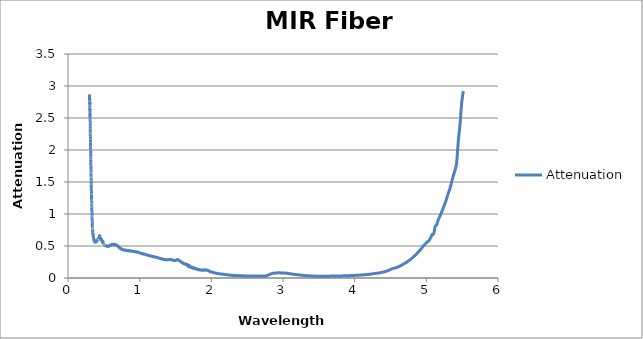
| Category | Attenuation |
|---|---|
| 0.30052 | 2.867 |
| 0.30089 | 2.803 |
| 0.30126 | 2.778 |
| 0.30163 | 2.82 |
| 0.302 | 2.788 |
| 0.30237 | 2.769 |
| 0.30274 | 2.752 |
| 0.30311 | 2.742 |
| 0.30347 | 2.718 |
| 0.30384 | 2.746 |
| 0.30421 | 2.695 |
| 0.30458 | 2.664 |
| 0.30495 | 2.626 |
| 0.30532 | 2.636 |
| 0.30568 | 2.626 |
| 0.30605 | 2.592 |
| 0.30642 | 2.564 |
| 0.30679 | 2.544 |
| 0.30716 | 2.553 |
| 0.30753 | 2.511 |
| 0.30789 | 2.491 |
| 0.30826 | 2.471 |
| 0.30863 | 2.463 |
| 0.309 | 2.429 |
| 0.30937 | 2.402 |
| 0.30973 | 2.368 |
| 0.3101 | 2.341 |
| 0.31047 | 2.325 |
| 0.31084 | 2.311 |
| 0.31121 | 2.275 |
| 0.31157 | 2.254 |
| 0.31194 | 2.24 |
| 0.31231 | 2.21 |
| 0.31268 | 2.174 |
| 0.31305 | 2.165 |
| 0.31342 | 2.125 |
| 0.31378 | 2.115 |
| 0.31415 | 2.078 |
| 0.31452 | 2.067 |
| 0.31489 | 2.038 |
| 0.31525 | 2.006 |
| 0.31562 | 1.993 |
| 0.31599 | 1.97 |
| 0.31636 | 1.951 |
| 0.31672 | 1.922 |
| 0.31709 | 1.897 |
| 0.31746 | 1.867 |
| 0.31783 | 1.852 |
| 0.31819 | 1.814 |
| 0.31856 | 1.804 |
| 0.31893 | 1.777 |
| 0.3193 | 1.759 |
| 0.31966 | 1.736 |
| 0.32003 | 1.719 |
| 0.3204 | 1.692 |
| 0.32076 | 1.669 |
| 0.32113 | 1.654 |
| 0.3215 | 1.631 |
| 0.32187 | 1.609 |
| 0.32223 | 1.586 |
| 0.3226 | 1.571 |
| 0.32297 | 1.551 |
| 0.32333 | 1.528 |
| 0.3237 | 1.513 |
| 0.32407 | 1.482 |
| 0.32443 | 1.46 |
| 0.3248 | 1.437 |
| 0.32517 | 1.422 |
| 0.32553 | 1.402 |
| 0.3259 | 1.379 |
| 0.32627 | 1.357 |
| 0.32663 | 1.343 |
| 0.327 | 1.324 |
| 0.32737 | 1.318 |
| 0.32773 | 1.306 |
| 0.3281 | 1.298 |
| 0.32847 | 1.282 |
| 0.32883 | 1.266 |
| 0.3292 | 1.229 |
| 0.32957 | 1.209 |
| 0.32993 | 1.194 |
| 0.3303 | 1.175 |
| 0.33067 | 1.165 |
| 0.33103 | 1.146 |
| 0.3314 | 1.127 |
| 0.33176 | 1.119 |
| 0.33213 | 1.104 |
| 0.3325 | 1.085 |
| 0.33286 | 1.062 |
| 0.33323 | 1.045 |
| 0.33359 | 1.035 |
| 0.33396 | 1.015 |
| 0.33433 | 1.002 |
| 0.33469 | 0.984 |
| 0.33506 | 0.981 |
| 0.33542 | 0.96 |
| 0.33579 | 0.94 |
| 0.33616 | 0.938 |
| 0.33652 | 0.92 |
| 0.33689 | 0.908 |
| 0.33725 | 0.896 |
| 0.33762 | 0.88 |
| 0.33798 | 0.869 |
| 0.33835 | 0.856 |
| 0.33872 | 0.845 |
| 0.33908 | 0.831 |
| 0.33982 | 0.795 |
| 0.34004 | 0.788 |
| 0.34025 | 0.79 |
| 0.34047 | 0.777 |
| 0.34068 | 0.774 |
| 0.3409 | 0.761 |
| 0.34111 | 0.759 |
| 0.34132 | 0.746 |
| 0.34154 | 0.743 |
| 0.34175 | 0.733 |
| 0.34197 | 0.734 |
| 0.34218 | 0.727 |
| 0.3424 | 0.731 |
| 0.34261 | 0.73 |
| 0.34283 | 0.734 |
| 0.34304 | 0.734 |
| 0.34326 | 0.741 |
| 0.34347 | 0.741 |
| 0.34368 | 0.746 |
| 0.3439 | 0.743 |
| 0.34411 | 0.747 |
| 0.34433 | 0.742 |
| 0.34454 | 0.741 |
| 0.34476 | 0.732 |
| 0.34497 | 0.728 |
| 0.34519 | 0.718 |
| 0.3454 | 0.715 |
| 0.34562 | 0.705 |
| 0.34583 | 0.702 |
| 0.34605 | 0.695 |
| 0.34626 | 0.692 |
| 0.34648 | 0.688 |
| 0.34669 | 0.689 |
| 0.34691 | 0.687 |
| 0.34712 | 0.69 |
| 0.34734 | 0.689 |
| 0.34755 | 0.694 |
| 0.34777 | 0.693 |
| 0.34798 | 0.696 |
| 0.3482 | 0.695 |
| 0.34841 | 0.696 |
| 0.34863 | 0.693 |
| 0.34884 | 0.692 |
| 0.34906 | 0.686 |
| 0.34927 | 0.682 |
| 0.34949 | 0.676 |
| 0.3497 | 0.672 |
| 0.34992 | 0.666 |
| 0.35013 | 0.663 |
| 0.35035 | 0.659 |
| 0.35056 | 0.658 |
| 0.35078 | 0.656 |
| 0.35099 | 0.657 |
| 0.35121 | 0.657 |
| 0.35142 | 0.66 |
| 0.35164 | 0.66 |
| 0.35185 | 0.662 |
| 0.35207 | 0.662 |
| 0.35228 | 0.664 |
| 0.3525 | 0.661 |
| 0.35271 | 0.661 |
| 0.35293 | 0.658 |
| 0.35314 | 0.655 |
| 0.35336 | 0.65 |
| 0.35358 | 0.647 |
| 0.35379 | 0.642 |
| 0.35401 | 0.639 |
| 0.35422 | 0.634 |
| 0.35444 | 0.633 |
| 0.35465 | 0.628 |
| 0.35487 | 0.628 |
| 0.35508 | 0.628 |
| 0.3553 | 0.629 |
| 0.35551 | 0.629 |
| 0.35573 | 0.631 |
| 0.35594 | 0.632 |
| 0.35616 | 0.634 |
| 0.35638 | 0.633 |
| 0.35659 | 0.635 |
| 0.35681 | 0.634 |
| 0.35702 | 0.633 |
| 0.35724 | 0.629 |
| 0.35745 | 0.628 |
| 0.35767 | 0.624 |
| 0.35788 | 0.622 |
| 0.3581 | 0.617 |
| 0.35832 | 0.615 |
| 0.35853 | 0.611 |
| 0.35875 | 0.608 |
| 0.35896 | 0.606 |
| 0.35918 | 0.607 |
| 0.35939 | 0.605 |
| 0.35961 | 0.606 |
| 0.35983 | 0.606 |
| 0.36004 | 0.608 |
| 0.36026 | 0.608 |
| 0.36047 | 0.61 |
| 0.36069 | 0.61 |
| 0.3609 | 0.611 |
| 0.36112 | 0.609 |
| 0.36134 | 0.609 |
| 0.36155 | 0.607 |
| 0.36177 | 0.607 |
| 0.36198 | 0.604 |
| 0.3622 | 0.602 |
| 0.36242 | 0.6 |
| 0.36263 | 0.599 |
| 0.36285 | 0.596 |
| 0.36306 | 0.595 |
| 0.36328 | 0.592 |
| 0.3635 | 0.592 |
| 0.36371 | 0.59 |
| 0.36393 | 0.591 |
| 0.36414 | 0.59 |
| 0.36436 | 0.591 |
| 0.36458 | 0.591 |
| 0.36479 | 0.592 |
| 0.36501 | 0.591 |
| 0.36522 | 0.592 |
| 0.36544 | 0.591 |
| 0.36566 | 0.591 |
| 0.36587 | 0.589 |
| 0.36609 | 0.589 |
| 0.3663 | 0.586 |
| 0.36652 | 0.585 |
| 0.36674 | 0.583 |
| 0.36695 | 0.583 |
| 0.36717 | 0.58 |
| 0.36739 | 0.58 |
| 0.3676 | 0.578 |
| 0.36782 | 0.578 |
| 0.36803 | 0.577 |
| 0.36825 | 0.579 |
| 0.36847 | 0.578 |
| 0.36868 | 0.58 |
| 0.3689 | 0.579 |
| 0.36912 | 0.581 |
| 0.36933 | 0.58 |
| 0.36955 | 0.581 |
| 0.36977 | 0.58 |
| 0.36998 | 0.58 |
| 0.3702 | 0.578 |
| 0.37041 | 0.579 |
| 0.37063 | 0.576 |
| 0.37085 | 0.575 |
| 0.37106 | 0.573 |
| 0.37128 | 0.573 |
| 0.3715 | 0.571 |
| 0.37171 | 0.572 |
| 0.37193 | 0.571 |
| 0.37215 | 0.572 |
| 0.37236 | 0.57 |
| 0.37258 | 0.572 |
| 0.3728 | 0.572 |
| 0.37301 | 0.573 |
| 0.37323 | 0.572 |
| 0.37345 | 0.574 |
| 0.37366 | 0.573 |
| 0.37388 | 0.574 |
| 0.3741 | 0.572 |
| 0.37431 | 0.573 |
| 0.37453 | 0.571 |
| 0.37475 | 0.571 |
| 0.37496 | 0.568 |
| 0.37518 | 0.569 |
| 0.3754 | 0.566 |
| 0.37561 | 0.566 |
| 0.37583 | 0.565 |
| 0.37605 | 0.565 |
| 0.37626 | 0.564 |
| 0.37648 | 0.565 |
| 0.3767 | 0.564 |
| 0.37691 | 0.566 |
| 0.37713 | 0.565 |
| 0.37735 | 0.567 |
| 0.37756 | 0.566 |
| 0.37778 | 0.568 |
| 0.378 | 0.567 |
| 0.37822 | 0.569 |
| 0.37843 | 0.568 |
| 0.37865 | 0.569 |
| 0.37887 | 0.567 |
| 0.37908 | 0.568 |
| 0.3793 | 0.566 |
| 0.37952 | 0.566 |
| 0.37973 | 0.564 |
| 0.37995 | 0.564 |
| 0.38017 | 0.563 |
| 0.38039 | 0.564 |
| 0.3806 | 0.562 |
| 0.38082 | 0.564 |
| 0.38104 | 0.562 |
| 0.38125 | 0.564 |
| 0.38147 | 0.564 |
| 0.38169 | 0.566 |
| 0.38191 | 0.565 |
| 0.38212 | 0.566 |
| 0.38234 | 0.565 |
| 0.38256 | 0.566 |
| 0.38277 | 0.564 |
| 0.38299 | 0.565 |
| 0.38321 | 0.564 |
| 0.38343 | 0.564 |
| 0.38364 | 0.562 |
| 0.38386 | 0.563 |
| 0.38408 | 0.561 |
| 0.38429 | 0.563 |
| 0.38451 | 0.561 |
| 0.38473 | 0.563 |
| 0.38495 | 0.561 |
| 0.38516 | 0.563 |
| 0.38538 | 0.562 |
| 0.3856 | 0.564 |
| 0.38582 | 0.563 |
| 0.38603 | 0.565 |
| 0.38625 | 0.565 |
| 0.38647 | 0.566 |
| 0.38669 | 0.565 |
| 0.3869 | 0.568 |
| 0.38712 | 0.566 |
| 0.38734 | 0.568 |
| 0.38756 | 0.566 |
| 0.38777 | 0.567 |
| 0.38799 | 0.565 |
| 0.38821 | 0.567 |
| 0.38843 | 0.565 |
| 0.38864 | 0.566 |
| 0.38886 | 0.565 |
| 0.38908 | 0.566 |
| 0.3893 | 0.565 |
| 0.38951 | 0.567 |
| 0.38973 | 0.566 |
| 0.38995 | 0.569 |
| 0.39017 | 0.568 |
| 0.39039 | 0.571 |
| 0.3906 | 0.569 |
| 0.39082 | 0.571 |
| 0.39104 | 0.57 |
| 0.39126 | 0.572 |
| 0.39147 | 0.57 |
| 0.39169 | 0.572 |
| 0.39191 | 0.571 |
| 0.39213 | 0.572 |
| 0.39235 | 0.571 |
| 0.39256 | 0.572 |
| 0.39278 | 0.57 |
| 0.393 | 0.572 |
| 0.39322 | 0.571 |
| 0.39343 | 0.572 |
| 0.39365 | 0.571 |
| 0.39387 | 0.572 |
| 0.39409 | 0.571 |
| 0.39431 | 0.573 |
| 0.39452 | 0.573 |
| 0.39474 | 0.575 |
| 0.39496 | 0.575 |
| 0.39518 | 0.577 |
| 0.3954 | 0.576 |
| 0.39561 | 0.577 |
| 0.39583 | 0.576 |
| 0.39605 | 0.578 |
| 0.39627 | 0.576 |
| 0.39649 | 0.577 |
| 0.3967 | 0.576 |
| 0.39692 | 0.577 |
| 0.39714 | 0.576 |
| 0.39736 | 0.578 |
| 0.39758 | 0.577 |
| 0.3978 | 0.578 |
| 0.39801 | 0.577 |
| 0.39823 | 0.579 |
| 0.39845 | 0.579 |
| 0.39867 | 0.579 |
| 0.39889 | 0.579 |
| 0.3991 | 0.58 |
| 0.39932 | 0.58 |
| 0.39954 | 0.581 |
| 0.39976 | 0.58 |
| 0.39998 | 0.581 |
| 0.4002 | 0.58 |
| 0.40041 | 0.581 |
| 0.40063 | 0.58 |
| 0.40085 | 0.58 |
| 0.40107 | 0.579 |
| 0.40129 | 0.579 |
| 0.40151 | 0.578 |
| 0.40172 | 0.579 |
| 0.40194 | 0.578 |
| 0.40216 | 0.579 |
| 0.40238 | 0.58 |
| 0.4026 | 0.581 |
| 0.40282 | 0.582 |
| 0.40304 | 0.582 |
| 0.40325 | 0.583 |
| 0.40347 | 0.583 |
| 0.40369 | 0.584 |
| 0.40391 | 0.584 |
| 0.40413 | 0.585 |
| 0.40435 | 0.584 |
| 0.40457 | 0.585 |
| 0.40478 | 0.584 |
| 0.405 | 0.585 |
| 0.40522 | 0.584 |
| 0.40544 | 0.584 |
| 0.40566 | 0.583 |
| 0.40588 | 0.584 |
| 0.4061 | 0.583 |
| 0.40631 | 0.584 |
| 0.40653 | 0.583 |
| 0.40675 | 0.584 |
| 0.40697 | 0.584 |
| 0.40719 | 0.586 |
| 0.40741 | 0.586 |
| 0.40763 | 0.588 |
| 0.40785 | 0.588 |
| 0.40806 | 0.59 |
| 0.40828 | 0.589 |
| 0.4085 | 0.59 |
| 0.40872 | 0.589 |
| 0.40894 | 0.59 |
| 0.40916 | 0.589 |
| 0.40938 | 0.59 |
| 0.4096 | 0.588 |
| 0.40982 | 0.589 |
| 0.41003 | 0.588 |
| 0.41025 | 0.59 |
| 0.41047 | 0.589 |
| 0.41069 | 0.591 |
| 0.41091 | 0.59 |
| 0.41113 | 0.592 |
| 0.41135 | 0.592 |
| 0.41157 | 0.594 |
| 0.41179 | 0.594 |
| 0.41201 | 0.596 |
| 0.41222 | 0.596 |
| 0.41244 | 0.597 |
| 0.41266 | 0.597 |
| 0.41288 | 0.598 |
| 0.4131 | 0.597 |
| 0.41332 | 0.598 |
| 0.41354 | 0.596 |
| 0.41376 | 0.597 |
| 0.41398 | 0.596 |
| 0.4142 | 0.597 |
| 0.41442 | 0.596 |
| 0.41464 | 0.597 |
| 0.41485 | 0.597 |
| 0.41507 | 0.599 |
| 0.41529 | 0.599 |
| 0.41551 | 0.6 |
| 0.41573 | 0.6 |
| 0.41595 | 0.601 |
| 0.41617 | 0.601 |
| 0.41639 | 0.603 |
| 0.41661 | 0.602 |
| 0.41683 | 0.603 |
| 0.41705 | 0.603 |
| 0.41727 | 0.604 |
| 0.41749 | 0.603 |
| 0.41771 | 0.604 |
| 0.41793 | 0.603 |
| 0.41814 | 0.604 |
| 0.41836 | 0.603 |
| 0.41858 | 0.604 |
| 0.4188 | 0.603 |
| 0.41902 | 0.604 |
| 0.41924 | 0.603 |
| 0.41946 | 0.605 |
| 0.41968 | 0.605 |
| 0.4199 | 0.607 |
| 0.42012 | 0.607 |
| 0.42034 | 0.609 |
| 0.42056 | 0.609 |
| 0.42078 | 0.611 |
| 0.421 | 0.611 |
| 0.42122 | 0.612 |
| 0.42144 | 0.611 |
| 0.42166 | 0.612 |
| 0.42188 | 0.611 |
| 0.4221 | 0.612 |
| 0.42232 | 0.61 |
| 0.42254 | 0.611 |
| 0.42276 | 0.609 |
| 0.42298 | 0.61 |
| 0.42319 | 0.609 |
| 0.42341 | 0.609 |
| 0.42363 | 0.609 |
| 0.42385 | 0.61 |
| 0.42407 | 0.609 |
| 0.42429 | 0.61 |
| 0.42451 | 0.609 |
| 0.42473 | 0.61 |
| 0.42495 | 0.61 |
| 0.42517 | 0.61 |
| 0.42539 | 0.61 |
| 0.42561 | 0.611 |
| 0.42583 | 0.61 |
| 0.42605 | 0.611 |
| 0.42627 | 0.611 |
| 0.42649 | 0.612 |
| 0.42671 | 0.612 |
| 0.42693 | 0.613 |
| 0.42715 | 0.612 |
| 0.42737 | 0.614 |
| 0.42759 | 0.613 |
| 0.42781 | 0.614 |
| 0.42803 | 0.613 |
| 0.42825 | 0.614 |
| 0.42847 | 0.613 |
| 0.42869 | 0.615 |
| 0.42891 | 0.615 |
| 0.42913 | 0.617 |
| 0.42935 | 0.617 |
| 0.42957 | 0.619 |
| 0.42979 | 0.619 |
| 0.43001 | 0.62 |
| 0.43023 | 0.619 |
| 0.43045 | 0.619 |
| 0.43067 | 0.617 |
| 0.43089 | 0.617 |
| 0.43111 | 0.616 |
| 0.43133 | 0.616 |
| 0.43155 | 0.615 |
| 0.43177 | 0.615 |
| 0.432 | 0.614 |
| 0.43222 | 0.616 |
| 0.43244 | 0.617 |
| 0.43266 | 0.62 |
| 0.43288 | 0.622 |
| 0.4331 | 0.625 |
| 0.43332 | 0.625 |
| 0.43354 | 0.626 |
| 0.43376 | 0.626 |
| 0.43398 | 0.628 |
| 0.4342 | 0.628 |
| 0.43442 | 0.629 |
| 0.43464 | 0.628 |
| 0.43486 | 0.628 |
| 0.43508 | 0.628 |
| 0.4353 | 0.63 |
| 0.43552 | 0.631 |
| 0.43574 | 0.634 |
| 0.43596 | 0.634 |
| 0.43618 | 0.636 |
| 0.4364 | 0.636 |
| 0.43662 | 0.638 |
| 0.43684 | 0.639 |
| 0.43706 | 0.641 |
| 0.43729 | 0.642 |
| 0.43751 | 0.644 |
| 0.43773 | 0.645 |
| 0.43795 | 0.647 |
| 0.43817 | 0.648 |
| 0.43839 | 0.651 |
| 0.43861 | 0.651 |
| 0.43883 | 0.653 |
| 0.43905 | 0.653 |
| 0.43927 | 0.655 |
| 0.43949 | 0.654 |
| 0.43971 | 0.656 |
| 0.43993 | 0.656 |
| 0.44015 | 0.658 |
| 0.44037 | 0.658 |
| 0.4406 | 0.66 |
| 0.44082 | 0.66 |
| 0.44104 | 0.661 |
| 0.44126 | 0.661 |
| 0.44148 | 0.662 |
| 0.4417 | 0.662 |
| 0.44192 | 0.662 |
| 0.44214 | 0.661 |
| 0.44236 | 0.662 |
| 0.44258 | 0.662 |
| 0.4428 | 0.662 |
| 0.44302 | 0.662 |
| 0.44325 | 0.662 |
| 0.44347 | 0.661 |
| 0.44369 | 0.661 |
| 0.44391 | 0.66 |
| 0.44413 | 0.659 |
| 0.44435 | 0.656 |
| 0.44457 | 0.655 |
| 0.44479 | 0.652 |
| 0.44501 | 0.651 |
| 0.44523 | 0.648 |
| 0.44546 | 0.647 |
| 0.44568 | 0.644 |
| 0.4459 | 0.643 |
| 0.44612 | 0.64 |
| 0.44634 | 0.639 |
| 0.44656 | 0.636 |
| 0.44678 | 0.636 |
| 0.447 | 0.634 |
| 0.44722 | 0.632 |
| 0.44745 | 0.63 |
| 0.44767 | 0.63 |
| 0.44789 | 0.627 |
| 0.44811 | 0.627 |
| 0.44833 | 0.624 |
| 0.44855 | 0.624 |
| 0.44877 | 0.622 |
| 0.44899 | 0.621 |
| 0.44922 | 0.619 |
| 0.44944 | 0.619 |
| 0.44966 | 0.617 |
| 0.44988 | 0.616 |
| 0.4501 | 0.614 |
| 0.45032 | 0.614 |
| 0.45054 | 0.613 |
| 0.45077 | 0.613 |
| 0.45099 | 0.612 |
| 0.45121 | 0.613 |
| 0.45143 | 0.611 |
| 0.45165 | 0.612 |
| 0.45187 | 0.61 |
| 0.45209 | 0.611 |
| 0.45232 | 0.609 |
| 0.45254 | 0.609 |
| 0.45276 | 0.608 |
| 0.45298 | 0.608 |
| 0.4532 | 0.606 |
| 0.45342 | 0.606 |
| 0.45364 | 0.604 |
| 0.45387 | 0.605 |
| 0.45409 | 0.604 |
| 0.45431 | 0.605 |
| 0.45453 | 0.604 |
| 0.45475 | 0.605 |
| 0.45497 | 0.604 |
| 0.4552 | 0.604 |
| 0.45542 | 0.603 |
| 0.45564 | 0.604 |
| 0.45586 | 0.603 |
| 0.45608 | 0.604 |
| 0.4563 | 0.603 |
| 0.45653 | 0.603 |
| 0.45675 | 0.602 |
| 0.45697 | 0.603 |
| 0.45719 | 0.602 |
| 0.45741 | 0.603 |
| 0.45763 | 0.602 |
| 0.45786 | 0.603 |
| 0.45808 | 0.602 |
| 0.4583 | 0.603 |
| 0.45852 | 0.602 |
| 0.45874 | 0.602 |
| 0.45896 | 0.602 |
| 0.45919 | 0.602 |
| 0.45941 | 0.602 |
| 0.45963 | 0.601 |
| 0.45985 | 0.601 |
| 0.46007 | 0.601 |
| 0.4603 | 0.601 |
| 0.46052 | 0.601 |
| 0.46074 | 0.601 |
| 0.46096 | 0.599 |
| 0.46118 | 0.6 |
| 0.46141 | 0.599 |
| 0.46163 | 0.6 |
| 0.46185 | 0.599 |
| 0.46207 | 0.599 |
| 0.46229 | 0.599 |
| 0.46252 | 0.6 |
| 0.46274 | 0.601 |
| 0.46296 | 0.603 |
| 0.46318 | 0.603 |
| 0.4634 | 0.605 |
| 0.46363 | 0.605 |
| 0.46385 | 0.607 |
| 0.46407 | 0.607 |
| 0.46429 | 0.608 |
| 0.46452 | 0.608 |
| 0.46474 | 0.609 |
| 0.46496 | 0.609 |
| 0.46518 | 0.61 |
| 0.4654 | 0.608 |
| 0.46563 | 0.608 |
| 0.46585 | 0.607 |
| 0.46607 | 0.607 |
| 0.46629 | 0.606 |
| 0.46652 | 0.606 |
| 0.46674 | 0.604 |
| 0.46696 | 0.604 |
| 0.46718 | 0.603 |
| 0.4674 | 0.604 |
| 0.46763 | 0.603 |
| 0.46785 | 0.603 |
| 0.46807 | 0.601 |
| 0.46829 | 0.601 |
| 0.46852 | 0.599 |
| 0.46874 | 0.599 |
| 0.46896 | 0.596 |
| 0.46918 | 0.595 |
| 0.46941 | 0.593 |
| 0.46963 | 0.592 |
| 0.46985 | 0.59 |
| 0.47007 | 0.589 |
| 0.4703 | 0.587 |
| 0.47052 | 0.586 |
| 0.47074 | 0.584 |
| 0.47096 | 0.584 |
| 0.47119 | 0.582 |
| 0.47141 | 0.582 |
| 0.47163 | 0.58 |
| 0.47185 | 0.581 |
| 0.47208 | 0.58 |
| 0.4723 | 0.58 |
| 0.47252 | 0.579 |
| 0.47274 | 0.579 |
| 0.47297 | 0.578 |
| 0.47319 | 0.578 |
| 0.47341 | 0.577 |
| 0.47363 | 0.577 |
| 0.47386 | 0.575 |
| 0.47408 | 0.575 |
| 0.4743 | 0.575 |
| 0.47453 | 0.575 |
| 0.47475 | 0.573 |
| 0.47497 | 0.573 |
| 0.47519 | 0.572 |
| 0.47542 | 0.573 |
| 0.47564 | 0.573 |
| 0.47586 | 0.573 |
| 0.47609 | 0.572 |
| 0.47631 | 0.572 |
| 0.47653 | 0.572 |
| 0.47675 | 0.574 |
| 0.47698 | 0.575 |
| 0.4772 | 0.577 |
| 0.47742 | 0.578 |
| 0.47765 | 0.579 |
| 0.47787 | 0.579 |
| 0.47809 | 0.581 |
| 0.47831 | 0.581 |
| 0.47854 | 0.582 |
| 0.47876 | 0.582 |
| 0.47898 | 0.583 |
| 0.47921 | 0.582 |
| 0.47943 | 0.583 |
| 0.47965 | 0.582 |
| 0.47987 | 0.582 |
| 0.4801 | 0.581 |
| 0.48032 | 0.58 |
| 0.48054 | 0.579 |
| 0.48077 | 0.579 |
| 0.48099 | 0.577 |
| 0.48121 | 0.576 |
| 0.48144 | 0.574 |
| 0.48166 | 0.573 |
| 0.48188 | 0.571 |
| 0.48211 | 0.57 |
| 0.48233 | 0.568 |
| 0.48255 | 0.568 |
| 0.48278 | 0.565 |
| 0.483 | 0.565 |
| 0.48322 | 0.563 |
| 0.48345 | 0.563 |
| 0.48367 | 0.562 |
| 0.48389 | 0.562 |
| 0.48411 | 0.561 |
| 0.48434 | 0.561 |
| 0.48456 | 0.562 |
| 0.48478 | 0.577 |
| 0.48501 | 0.585 |
| 0.48523 | 0.583 |
| 0.48545 | 0.577 |
| 0.48568 | 0.572 |
| 0.4859 | 0.569 |
| 0.48613 | 0.567 |
| 0.48635 | 0.567 |
| 0.48657 | 0.565 |
| 0.4868 | 0.558 |
| 0.48702 | 0.547 |
| 0.48724 | 0.539 |
| 0.48747 | 0.538 |
| 0.48769 | 0.54 |
| 0.48791 | 0.543 |
| 0.48814 | 0.544 |
| 0.48836 | 0.544 |
| 0.48858 | 0.543 |
| 0.48881 | 0.543 |
| 0.48903 | 0.543 |
| 0.48925 | 0.543 |
| 0.48948 | 0.543 |
| 0.4897 | 0.543 |
| 0.48992 | 0.542 |
| 0.49015 | 0.542 |
| 0.49037 | 0.541 |
| 0.4906 | 0.541 |
| 0.49082 | 0.54 |
| 0.49104 | 0.54 |
| 0.49127 | 0.539 |
| 0.49149 | 0.539 |
| 0.49171 | 0.538 |
| 0.49194 | 0.538 |
| 0.49216 | 0.537 |
| 0.49238 | 0.537 |
| 0.49261 | 0.536 |
| 0.49283 | 0.537 |
| 0.49306 | 0.535 |
| 0.49328 | 0.535 |
| 0.4935 | 0.535 |
| 0.49373 | 0.535 |
| 0.49395 | 0.534 |
| 0.49418 | 0.534 |
| 0.4944 | 0.533 |
| 0.49462 | 0.533 |
| 0.49485 | 0.532 |
| 0.49507 | 0.533 |
| 0.49529 | 0.534 |
| 0.49552 | 0.535 |
| 0.49574 | 0.534 |
| 0.49597 | 0.534 |
| 0.49619 | 0.533 |
| 0.49641 | 0.533 |
| 0.49664 | 0.532 |
| 0.49686 | 0.532 |
| 0.49709 | 0.53 |
| 0.49731 | 0.529 |
| 0.49753 | 0.528 |
| 0.49776 | 0.528 |
| 0.49798 | 0.528 |
| 0.49821 | 0.529 |
| 0.49843 | 0.529 |
| 0.49865 | 0.53 |
| 0.49888 | 0.53 |
| 0.4991 | 0.531 |
| 0.49933 | 0.53 |
| 0.49955 | 0.529 |
| 0.49977 | 0.528 |
| 0.5 | 0.528 |
| 0.50022 | 0.527 |
| 0.50045 | 0.528 |
| 0.50067 | 0.527 |
| 0.5009 | 0.526 |
| 0.50112 | 0.525 |
| 0.50134 | 0.526 |
| 0.50157 | 0.526 |
| 0.50179 | 0.526 |
| 0.50202 | 0.525 |
| 0.50224 | 0.525 |
| 0.50247 | 0.524 |
| 0.50269 | 0.525 |
| 0.50291 | 0.525 |
| 0.50314 | 0.525 |
| 0.50336 | 0.524 |
| 0.50359 | 0.524 |
| 0.50381 | 0.523 |
| 0.50404 | 0.524 |
| 0.50426 | 0.523 |
| 0.50448 | 0.523 |
| 0.50471 | 0.522 |
| 0.50493 | 0.522 |
| 0.50516 | 0.521 |
| 0.50538 | 0.521 |
| 0.50561 | 0.521 |
| 0.50583 | 0.521 |
| 0.50606 | 0.52 |
| 0.50628 | 0.519 |
| 0.5065 | 0.518 |
| 0.50673 | 0.518 |
| 0.50695 | 0.518 |
| 0.50718 | 0.519 |
| 0.5074 | 0.518 |
| 0.50763 | 0.518 |
| 0.50785 | 0.517 |
| 0.50808 | 0.518 |
| 0.5083 | 0.517 |
| 0.50853 | 0.518 |
| 0.50875 | 0.518 |
| 0.50898 | 0.518 |
| 0.5092 | 0.516 |
| 0.50942 | 0.516 |
| 0.50965 | 0.516 |
| 0.50987 | 0.515 |
| 0.5101 | 0.515 |
| 0.51032 | 0.515 |
| 0.51055 | 0.514 |
| 0.51077 | 0.515 |
| 0.511 | 0.514 |
| 0.51122 | 0.514 |
| 0.51145 | 0.513 |
| 0.51167 | 0.514 |
| 0.5119 | 0.513 |
| 0.51212 | 0.513 |
| 0.51235 | 0.513 |
| 0.51257 | 0.513 |
| 0.5128 | 0.512 |
| 0.51302 | 0.512 |
| 0.51325 | 0.512 |
| 0.51347 | 0.512 |
| 0.5137 | 0.511 |
| 0.51392 | 0.511 |
| 0.51415 | 0.51 |
| 0.51437 | 0.509 |
| 0.5146 | 0.508 |
| 0.51482 | 0.508 |
| 0.51505 | 0.508 |
| 0.51527 | 0.509 |
| 0.51549 | 0.508 |
| 0.51572 | 0.508 |
| 0.51595 | 0.508 |
| 0.51617 | 0.509 |
| 0.5164 | 0.509 |
| 0.51662 | 0.509 |
| 0.51685 | 0.51 |
| 0.51707 | 0.509 |
| 0.5173 | 0.509 |
| 0.51752 | 0.509 |
| 0.51775 | 0.509 |
| 0.51797 | 0.508 |
| 0.5182 | 0.508 |
| 0.51842 | 0.508 |
| 0.51865 | 0.508 |
| 0.51887 | 0.507 |
| 0.5191 | 0.506 |
| 0.51932 | 0.505 |
| 0.51955 | 0.505 |
| 0.51977 | 0.505 |
| 0.52 | 0.505 |
| 0.5202 | 0.511 |
| 0.5215 | 0.508 |
| 0.5228 | 0.506 |
| 0.5241 | 0.505 |
| 0.5254 | 0.506 |
| 0.5267 | 0.508 |
| 0.528 | 0.508 |
| 0.5293 | 0.503 |
| 0.5306 | 0.503 |
| 0.5319 | 0.504 |
| 0.5332 | 0.504 |
| 0.5345 | 0.503 |
| 0.5358 | 0.505 |
| 0.5371 | 0.503 |
| 0.5384 | 0.499 |
| 0.5397 | 0.498 |
| 0.541 | 0.501 |
| 0.5423 | 0.497 |
| 0.5436 | 0.497 |
| 0.5449 | 0.499 |
| 0.5462 | 0.496 |
| 0.5475 | 0.497 |
| 0.5488 | 0.498 |
| 0.5501 | 0.497 |
| 0.5514 | 0.497 |
| 0.5527 | 0.495 |
| 0.554 | 0.496 |
| 0.5553 | 0.497 |
| 0.5566 | 0.494 |
| 0.5579 | 0.496 |
| 0.5592 | 0.497 |
| 0.5605 | 0.495 |
| 0.5618 | 0.496 |
| 0.5631 | 0.497 |
| 0.5644 | 0.496 |
| 0.5657 | 0.497 |
| 0.567 | 0.496 |
| 0.5683 | 0.497 |
| 0.5696 | 0.496 |
| 0.5709 | 0.501 |
| 0.5722 | 0.501 |
| 0.5735 | 0.499 |
| 0.5748 | 0.502 |
| 0.5761 | 0.503 |
| 0.5774 | 0.504 |
| 0.5787 | 0.505 |
| 0.58 | 0.506 |
| 0.5813 | 0.51 |
| 0.5826 | 0.51 |
| 0.5839 | 0.51 |
| 0.5852 | 0.51 |
| 0.5865 | 0.511 |
| 0.5878 | 0.511 |
| 0.5891 | 0.512 |
| 0.5904 | 0.511 |
| 0.5917 | 0.516 |
| 0.593 | 0.511 |
| 0.5943 | 0.512 |
| 0.5956 | 0.51 |
| 0.5969 | 0.51 |
| 0.5982 | 0.511 |
| 0.5995 | 0.509 |
| 0.6008 | 0.518 |
| 0.6021 | 0.517 |
| 0.6034 | 0.521 |
| 0.6047 | 0.519 |
| 0.606 | 0.518 |
| 0.6073 | 0.517 |
| 0.6086 | 0.522 |
| 0.6099 | 0.519 |
| 0.6112 | 0.518 |
| 0.6125 | 0.518 |
| 0.6138 | 0.522 |
| 0.6151 | 0.517 |
| 0.6164 | 0.519 |
| 0.6177 | 0.523 |
| 0.619 | 0.521 |
| 0.6203 | 0.517 |
| 0.6216 | 0.521 |
| 0.6229 | 0.519 |
| 0.6242 | 0.518 |
| 0.6255 | 0.521 |
| 0.6268 | 0.522 |
| 0.6281 | 0.523 |
| 0.6294 | 0.523 |
| 0.6307 | 0.523 |
| 0.632 | 0.524 |
| 0.6333 | 0.525 |
| 0.6346 | 0.528 |
| 0.6359 | 0.523 |
| 0.6372 | 0.525 |
| 0.6385 | 0.526 |
| 0.6398 | 0.523 |
| 0.6411 | 0.526 |
| 0.6424 | 0.529 |
| 0.6437 | 0.521 |
| 0.645 | 0.523 |
| 0.6463 | 0.524 |
| 0.6476 | 0.522 |
| 0.6489 | 0.522 |
| 0.6502 | 0.517 |
| 0.6515 | 0.515 |
| 0.6528 | 0.514 |
| 0.6541 | 0.516 |
| 0.6554 | 0.512 |
| 0.6567 | 0.519 |
| 0.658 | 0.516 |
| 0.6593 | 0.517 |
| 0.6606 | 0.512 |
| 0.6619 | 0.514 |
| 0.6632 | 0.515 |
| 0.6645 | 0.515 |
| 0.6658 | 0.514 |
| 0.6671 | 0.514 |
| 0.6684 | 0.516 |
| 0.6697 | 0.519 |
| 0.671 | 0.514 |
| 0.6723 | 0.517 |
| 0.6736 | 0.519 |
| 0.6749 | 0.514 |
| 0.6762 | 0.515 |
| 0.6775 | 0.515 |
| 0.6788 | 0.514 |
| 0.6801 | 0.511 |
| 0.6814 | 0.51 |
| 0.6827 | 0.515 |
| 0.684 | 0.51 |
| 0.6853 | 0.509 |
| 0.6866 | 0.506 |
| 0.6879 | 0.508 |
| 0.6892 | 0.503 |
| 0.6905 | 0.504 |
| 0.6918 | 0.499 |
| 0.6931 | 0.498 |
| 0.6944 | 0.499 |
| 0.6957 | 0.499 |
| 0.697 | 0.496 |
| 0.6983 | 0.495 |
| 0.6996 | 0.491 |
| 0.7009 | 0.492 |
| 0.7022 | 0.49 |
| 0.7035 | 0.49 |
| 0.7048 | 0.489 |
| 0.7061 | 0.485 |
| 0.7074 | 0.486 |
| 0.7087 | 0.483 |
| 0.71 | 0.482 |
| 0.7113 | 0.482 |
| 0.7126 | 0.478 |
| 0.7139 | 0.481 |
| 0.7152 | 0.475 |
| 0.7165 | 0.475 |
| 0.7178 | 0.474 |
| 0.7191 | 0.47 |
| 0.7204 | 0.474 |
| 0.7217 | 0.47 |
| 0.723 | 0.469 |
| 0.7243 | 0.47 |
| 0.7256 | 0.465 |
| 0.7269 | 0.469 |
| 0.7282 | 0.465 |
| 0.7295 | 0.468 |
| 0.7308 | 0.462 |
| 0.7321 | 0.461 |
| 0.7334 | 0.459 |
| 0.7347 | 0.463 |
| 0.736 | 0.461 |
| 0.7373 | 0.459 |
| 0.7386 | 0.456 |
| 0.7399 | 0.457 |
| 0.7412 | 0.458 |
| 0.7425 | 0.456 |
| 0.7438 | 0.452 |
| 0.7451 | 0.452 |
| 0.7464 | 0.452 |
| 0.7477 | 0.45 |
| 0.749 | 0.45 |
| 0.7503 | 0.451 |
| 0.7516 | 0.45 |
| 0.7529 | 0.449 |
| 0.7542 | 0.448 |
| 0.7555 | 0.446 |
| 0.7568 | 0.446 |
| 0.7581 | 0.445 |
| 0.7594 | 0.444 |
| 0.7607 | 0.446 |
| 0.762 | 0.443 |
| 0.7633 | 0.444 |
| 0.7646 | 0.444 |
| 0.7659 | 0.445 |
| 0.7672 | 0.443 |
| 0.7685 | 0.443 |
| 0.7698 | 0.439 |
| 0.7711 | 0.442 |
| 0.7724 | 0.441 |
| 0.7737 | 0.441 |
| 0.775 | 0.439 |
| 0.7763 | 0.439 |
| 0.7776 | 0.439 |
| 0.7789 | 0.437 |
| 0.7802 | 0.441 |
| 0.7815 | 0.439 |
| 0.7828 | 0.437 |
| 0.7841 | 0.438 |
| 0.7854 | 0.437 |
| 0.7867 | 0.436 |
| 0.788 | 0.436 |
| 0.7893 | 0.437 |
| 0.7906 | 0.436 |
| 0.7919 | 0.435 |
| 0.7932 | 0.437 |
| 0.7945 | 0.435 |
| 0.7958 | 0.435 |
| 0.7971 | 0.437 |
| 0.7984 | 0.436 |
| 0.7997 | 0.438 |
| 0.801 | 0.436 |
| 0.8023 | 0.436 |
| 0.8036 | 0.436 |
| 0.8049 | 0.435 |
| 0.8062 | 0.436 |
| 0.8075 | 0.434 |
| 0.8088 | 0.435 |
| 0.8101 | 0.434 |
| 0.8114 | 0.434 |
| 0.8127 | 0.432 |
| 0.814 | 0.432 |
| 0.8153 | 0.434 |
| 0.8166 | 0.432 |
| 0.8179 | 0.43 |
| 0.8192 | 0.43 |
| 0.8205 | 0.43 |
| 0.8218 | 0.429 |
| 0.8231 | 0.429 |
| 0.8244 | 0.429 |
| 0.8257 | 0.431 |
| 0.827 | 0.429 |
| 0.8283 | 0.429 |
| 0.8296 | 0.429 |
| 0.8309 | 0.429 |
| 0.8322 | 0.429 |
| 0.8335 | 0.43 |
| 0.8348 | 0.43 |
| 0.8361 | 0.426 |
| 0.8374 | 0.426 |
| 0.8387 | 0.428 |
| 0.84 | 0.429 |
| 0.8413 | 0.429 |
| 0.8426 | 0.428 |
| 0.8439 | 0.43 |
| 0.8452 | 0.429 |
| 0.8465 | 0.426 |
| 0.8478 | 0.428 |
| 0.8491 | 0.425 |
| 0.8504 | 0.426 |
| 0.8517 | 0.426 |
| 0.853 | 0.428 |
| 0.8543 | 0.424 |
| 0.8556 | 0.428 |
| 0.8569 | 0.426 |
| 0.8582 | 0.424 |
| 0.8595 | 0.425 |
| 0.8608 | 0.423 |
| 0.8621 | 0.424 |
| 0.8634 | 0.425 |
| 0.8647 | 0.423 |
| 0.866 | 0.424 |
| 0.8673 | 0.422 |
| 0.8686 | 0.424 |
| 0.8699 | 0.423 |
| 0.8712 | 0.421 |
| 0.8725 | 0.422 |
| 0.8738 | 0.423 |
| 0.8751 | 0.422 |
| 0.8764 | 0.421 |
| 0.8777 | 0.422 |
| 0.879 | 0.421 |
| 0.8803 | 0.421 |
| 0.8816 | 0.419 |
| 0.8829 | 0.422 |
| 0.8842 | 0.418 |
| 0.8855 | 0.418 |
| 0.8868 | 0.418 |
| 0.8881 | 0.418 |
| 0.8894 | 0.419 |
| 0.8907 | 0.421 |
| 0.892 | 0.418 |
| 0.8933 | 0.421 |
| 0.8946 | 0.421 |
| 0.8959 | 0.419 |
| 0.8972 | 0.418 |
| 0.8985 | 0.416 |
| 0.8998 | 0.418 |
| 0.9011 | 0.417 |
| 0.9024 | 0.417 |
| 0.9037 | 0.417 |
| 0.905 | 0.418 |
| 0.9063 | 0.416 |
| 0.9076 | 0.417 |
| 0.9089 | 0.416 |
| 0.9102 | 0.416 |
| 0.9115 | 0.416 |
| 0.9128 | 0.415 |
| 0.9141 | 0.416 |
| 0.9154 | 0.416 |
| 0.9167 | 0.414 |
| 0.918 | 0.415 |
| 0.9193 | 0.415 |
| 0.9206 | 0.412 |
| 0.9219 | 0.414 |
| 0.9232 | 0.412 |
| 0.9245 | 0.412 |
| 0.9258 | 0.412 |
| 0.9271 | 0.414 |
| 0.9284 | 0.412 |
| 0.9297 | 0.411 |
| 0.931 | 0.411 |
| 0.9323 | 0.412 |
| 0.9336 | 0.411 |
| 0.9349 | 0.41 |
| 0.9362 | 0.41 |
| 0.9375 | 0.409 |
| 0.9388 | 0.409 |
| 0.9401 | 0.41 |
| 0.9414 | 0.409 |
| 0.9427 | 0.409 |
| 0.944 | 0.409 |
| 0.9453 | 0.408 |
| 0.9466 | 0.408 |
| 0.9479 | 0.408 |
| 0.9492 | 0.409 |
| 0.9505 | 0.408 |
| 0.9518 | 0.405 |
| 0.9531 | 0.405 |
| 0.9544 | 0.406 |
| 0.9557 | 0.406 |
| 0.957 | 0.405 |
| 0.9583 | 0.404 |
| 0.9596 | 0.404 |
| 0.9609 | 0.404 |
| 0.9622 | 0.403 |
| 0.9635 | 0.404 |
| 0.9648 | 0.404 |
| 0.9661 | 0.405 |
| 0.9674 | 0.404 |
| 0.9687 | 0.405 |
| 0.97 | 0.406 |
| 0.9713 | 0.405 |
| 0.9726 | 0.409 |
| 0.9739 | 0.405 |
| 0.9752 | 0.406 |
| 0.9765 | 0.405 |
| 0.9778 | 0.405 |
| 0.9791 | 0.403 |
| 0.9804 | 0.402 |
| 0.9817 | 0.402 |
| 0.983 | 0.401 |
| 0.9843 | 0.399 |
| 0.9856 | 0.398 |
| 0.9869 | 0.398 |
| 0.9882 | 0.396 |
| 0.9895 | 0.396 |
| 0.9908 | 0.395 |
| 0.9921 | 0.396 |
| 0.9934 | 0.395 |
| 0.9947 | 0.396 |
| 0.996 | 0.395 |
| 0.9973 | 0.395 |
| 0.9986 | 0.392 |
| 0.9999 | 0.392 |
| 1.0012 | 0.392 |
| 1.0025 | 0.391 |
| 1.0038 | 0.391 |
| 1.0051 | 0.392 |
| 1.0064 | 0.39 |
| 1.0077 | 0.388 |
| 1.009 | 0.389 |
| 1.0103 | 0.389 |
| 1.0116 | 0.388 |
| 1.0129 | 0.386 |
| 1.0142 | 0.388 |
| 1.0155 | 0.385 |
| 1.0168 | 0.385 |
| 1.0181 | 0.386 |
| 1.0194 | 0.384 |
| 1.0207 | 0.384 |
| 1.022 | 0.385 |
| 1.0233 | 0.384 |
| 1.0246 | 0.384 |
| 1.0259 | 0.383 |
| 1.0272 | 0.382 |
| 1.0285 | 0.382 |
| 1.0298 | 0.379 |
| 1.0311 | 0.382 |
| 1.0324 | 0.382 |
| 1.0337 | 0.381 |
| 1.035 | 0.382 |
| 1.0363 | 0.379 |
| 1.0376 | 0.379 |
| 1.0389 | 0.378 |
| 1.0402 | 0.377 |
| 1.0415 | 0.378 |
| 1.0428 | 0.377 |
| 1.0441 | 0.378 |
| 1.0454 | 0.378 |
| 1.0467 | 0.377 |
| 1.048 | 0.377 |
| 1.0493 | 0.376 |
| 1.0506 | 0.376 |
| 1.0519 | 0.375 |
| 1.0532 | 0.376 |
| 1.0545 | 0.374 |
| 1.0558 | 0.375 |
| 1.0571 | 0.375 |
| 1.0584 | 0.372 |
| 1.0597 | 0.374 |
| 1.061 | 0.372 |
| 1.0623 | 0.374 |
| 1.0636 | 0.372 |
| 1.0649 | 0.372 |
| 1.0662 | 0.371 |
| 1.0675 | 0.37 |
| 1.0688 | 0.371 |
| 1.0701 | 0.372 |
| 1.0714 | 0.37 |
| 1.0727 | 0.37 |
| 1.074 | 0.37 |
| 1.0753 | 0.369 |
| 1.0766 | 0.37 |
| 1.0779 | 0.371 |
| 1.0792 | 0.369 |
| 1.0805 | 0.37 |
| 1.0818 | 0.369 |
| 1.0831 | 0.369 |
| 1.0844 | 0.368 |
| 1.0857 | 0.365 |
| 1.087 | 0.365 |
| 1.0883 | 0.366 |
| 1.0896 | 0.365 |
| 1.0909 | 0.364 |
| 1.0922 | 0.364 |
| 1.0935 | 0.362 |
| 1.0948 | 0.362 |
| 1.0961 | 0.363 |
| 1.0974 | 0.362 |
| 1.0987 | 0.361 |
| 1.1 | 0.361 |
| 1.1013 | 0.359 |
| 1.1026 | 0.358 |
| 1.1039 | 0.359 |
| 1.1052 | 0.358 |
| 1.1065 | 0.357 |
| 1.1078 | 0.358 |
| 1.1091 | 0.357 |
| 1.1104 | 0.357 |
| 1.1117 | 0.357 |
| 1.113 | 0.357 |
| 1.1143 | 0.356 |
| 1.1156 | 0.355 |
| 1.1169 | 0.355 |
| 1.1182 | 0.355 |
| 1.1195 | 0.352 |
| 1.1208 | 0.352 |
| 1.1221 | 0.354 |
| 1.1234 | 0.352 |
| 1.1247 | 0.352 |
| 1.126 | 0.351 |
| 1.1273 | 0.352 |
| 1.1286 | 0.35 |
| 1.1299 | 0.349 |
| 1.1312 | 0.351 |
| 1.1325 | 0.349 |
| 1.1338 | 0.35 |
| 1.1351 | 0.35 |
| 1.1364 | 0.349 |
| 1.1377 | 0.348 |
| 1.139 | 0.348 |
| 1.1403 | 0.346 |
| 1.1416 | 0.348 |
| 1.1429 | 0.345 |
| 1.1442 | 0.345 |
| 1.1455 | 0.346 |
| 1.1468 | 0.345 |
| 1.1481 | 0.345 |
| 1.1494 | 0.344 |
| 1.1507 | 0.345 |
| 1.152 | 0.344 |
| 1.1533 | 0.344 |
| 1.1546 | 0.344 |
| 1.1559 | 0.344 |
| 1.1572 | 0.344 |
| 1.1585 | 0.344 |
| 1.1598 | 0.342 |
| 1.1611 | 0.343 |
| 1.1624 | 0.342 |
| 1.1637 | 0.341 |
| 1.165 | 0.341 |
| 1.1663 | 0.342 |
| 1.1676 | 0.341 |
| 1.1689 | 0.339 |
| 1.1702 | 0.341 |
| 1.1715 | 0.337 |
| 1.1728 | 0.339 |
| 1.1741 | 0.337 |
| 1.1754 | 0.338 |
| 1.1767 | 0.337 |
| 1.178 | 0.337 |
| 1.1793 | 0.337 |
| 1.1806 | 0.336 |
| 1.1819 | 0.337 |
| 1.1832 | 0.335 |
| 1.1845 | 0.336 |
| 1.1858 | 0.336 |
| 1.1871 | 0.335 |
| 1.1884 | 0.337 |
| 1.1897 | 0.335 |
| 1.191 | 0.334 |
| 1.1923 | 0.334 |
| 1.1936 | 0.334 |
| 1.1949 | 0.334 |
| 1.1962 | 0.331 |
| 1.1975 | 0.331 |
| 1.1988 | 0.331 |
| 1.2001 | 0.331 |
| 1.2014 | 0.329 |
| 1.2027 | 0.33 |
| 1.204 | 0.331 |
| 1.2053 | 0.328 |
| 1.2066 | 0.329 |
| 1.2079 | 0.328 |
| 1.2092 | 0.329 |
| 1.2105 | 0.328 |
| 1.2118 | 0.328 |
| 1.2131 | 0.326 |
| 1.2144 | 0.326 |
| 1.2157 | 0.326 |
| 1.217 | 0.326 |
| 1.2183 | 0.328 |
| 1.2196 | 0.326 |
| 1.2209 | 0.326 |
| 1.2222 | 0.325 |
| 1.2235 | 0.328 |
| 1.2248 | 0.325 |
| 1.2261 | 0.325 |
| 1.2274 | 0.325 |
| 1.2287 | 0.324 |
| 1.23 | 0.325 |
| 1.2313 | 0.324 |
| 1.2326 | 0.323 |
| 1.2339 | 0.323 |
| 1.2352 | 0.323 |
| 1.2365 | 0.322 |
| 1.2378 | 0.322 |
| 1.2391 | 0.321 |
| 1.2404 | 0.321 |
| 1.2417 | 0.321 |
| 1.243 | 0.319 |
| 1.2443 | 0.321 |
| 1.2456 | 0.321 |
| 1.2469 | 0.319 |
| 1.2482 | 0.318 |
| 1.2495 | 0.317 |
| 1.2508 | 0.317 |
| 1.2521 | 0.319 |
| 1.2534 | 0.317 |
| 1.2547 | 0.316 |
| 1.256 | 0.316 |
| 1.2573 | 0.315 |
| 1.2586 | 0.314 |
| 1.2599 | 0.314 |
| 1.2612 | 0.315 |
| 1.2625 | 0.314 |
| 1.2638 | 0.312 |
| 1.2651 | 0.312 |
| 1.2664 | 0.311 |
| 1.2677 | 0.312 |
| 1.269 | 0.311 |
| 1.2703 | 0.311 |
| 1.2716 | 0.311 |
| 1.2729 | 0.311 |
| 1.2742 | 0.31 |
| 1.2755 | 0.311 |
| 1.2768 | 0.31 |
| 1.2781 | 0.31 |
| 1.2794 | 0.309 |
| 1.2807 | 0.309 |
| 1.282 | 0.309 |
| 1.2833 | 0.308 |
| 1.2846 | 0.306 |
| 1.2859 | 0.306 |
| 1.2872 | 0.308 |
| 1.2885 | 0.306 |
| 1.2898 | 0.305 |
| 1.2911 | 0.303 |
| 1.2924 | 0.303 |
| 1.2937 | 0.303 |
| 1.295 | 0.302 |
| 1.2963 | 0.302 |
| 1.2976 | 0.302 |
| 1.2989 | 0.301 |
| 1.3002 | 0.301 |
| 1.3015 | 0.299 |
| 1.3028 | 0.301 |
| 1.3041 | 0.299 |
| 1.3054 | 0.299 |
| 1.3067 | 0.298 |
| 1.308 | 0.297 |
| 1.3093 | 0.298 |
| 1.3106 | 0.298 |
| 1.3119 | 0.297 |
| 1.3132 | 0.297 |
| 1.3145 | 0.296 |
| 1.3158 | 0.297 |
| 1.3171 | 0.295 |
| 1.3184 | 0.295 |
| 1.3197 | 0.295 |
| 1.321 | 0.294 |
| 1.3223 | 0.295 |
| 1.3236 | 0.294 |
| 1.3249 | 0.294 |
| 1.3262 | 0.294 |
| 1.3275 | 0.292 |
| 1.3288 | 0.291 |
| 1.3301 | 0.292 |
| 1.3314 | 0.291 |
| 1.3327 | 0.291 |
| 1.334 | 0.29 |
| 1.3353 | 0.29 |
| 1.3366 | 0.289 |
| 1.3379 | 0.289 |
| 1.3392 | 0.29 |
| 1.3405 | 0.29 |
| 1.3418 | 0.289 |
| 1.3431 | 0.29 |
| 1.3444 | 0.29 |
| 1.3457 | 0.289 |
| 1.347 | 0.289 |
| 1.3483 | 0.289 |
| 1.3496 | 0.289 |
| 1.3509 | 0.289 |
| 1.3522 | 0.288 |
| 1.3535 | 0.288 |
| 1.3548 | 0.288 |
| 1.3561 | 0.288 |
| 1.3574 | 0.285 |
| 1.3587 | 0.285 |
| 1.36 | 0.286 |
| 1.3613 | 0.285 |
| 1.3626 | 0.285 |
| 1.3639 | 0.284 |
| 1.3652 | 0.285 |
| 1.3665 | 0.285 |
| 1.3678 | 0.285 |
| 1.3691 | 0.286 |
| 1.3704 | 0.286 |
| 1.3717 | 0.285 |
| 1.373 | 0.286 |
| 1.3743 | 0.286 |
| 1.3756 | 0.286 |
| 1.3769 | 0.285 |
| 1.3782 | 0.286 |
| 1.3795 | 0.286 |
| 1.3808 | 0.286 |
| 1.3821 | 0.285 |
| 1.3834 | 0.285 |
| 1.3847 | 0.284 |
| 1.386 | 0.285 |
| 1.3873 | 0.284 |
| 1.3886 | 0.284 |
| 1.3899 | 0.283 |
| 1.3912 | 0.284 |
| 1.3925 | 0.283 |
| 1.3938 | 0.285 |
| 1.3951 | 0.284 |
| 1.3964 | 0.284 |
| 1.3977 | 0.286 |
| 1.399 | 0.284 |
| 1.4003 | 0.286 |
| 1.4016 | 0.286 |
| 1.4029 | 0.286 |
| 1.4042 | 0.286 |
| 1.4055 | 0.288 |
| 1.4068 | 0.288 |
| 1.4081 | 0.286 |
| 1.4094 | 0.286 |
| 1.4107 | 0.288 |
| 1.412 | 0.286 |
| 1.4133 | 0.288 |
| 1.4146 | 0.288 |
| 1.4159 | 0.286 |
| 1.4172 | 0.288 |
| 1.4185 | 0.289 |
| 1.4198 | 0.289 |
| 1.4211 | 0.29 |
| 1.4224 | 0.289 |
| 1.4237 | 0.289 |
| 1.425 | 0.29 |
| 1.4263 | 0.289 |
| 1.4276 | 0.29 |
| 1.4289 | 0.291 |
| 1.4302 | 0.289 |
| 1.4315 | 0.29 |
| 1.4328 | 0.289 |
| 1.4341 | 0.29 |
| 1.4354 | 0.288 |
| 1.4367 | 0.288 |
| 1.438 | 0.286 |
| 1.4393 | 0.289 |
| 1.4406 | 0.288 |
| 1.4419 | 0.286 |
| 1.4432 | 0.286 |
| 1.4445 | 0.285 |
| 1.4458 | 0.284 |
| 1.4471 | 0.284 |
| 1.4484 | 0.283 |
| 1.4497 | 0.284 |
| 1.451 | 0.282 |
| 1.4523 | 0.283 |
| 1.4536 | 0.282 |
| 1.4549 | 0.281 |
| 1.4562 | 0.282 |
| 1.4575 | 0.283 |
| 1.4588 | 0.279 |
| 1.4601 | 0.282 |
| 1.4614 | 0.279 |
| 1.4627 | 0.279 |
| 1.464 | 0.281 |
| 1.4653 | 0.281 |
| 1.4666 | 0.279 |
| 1.4679 | 0.277 |
| 1.4692 | 0.278 |
| 1.4705 | 0.277 |
| 1.4718 | 0.277 |
| 1.4731 | 0.276 |
| 1.4744 | 0.275 |
| 1.4757 | 0.275 |
| 1.477 | 0.275 |
| 1.4783 | 0.272 |
| 1.4796 | 0.272 |
| 1.4809 | 0.274 |
| 1.4822 | 0.275 |
| 1.4835 | 0.275 |
| 1.4848 | 0.274 |
| 1.4861 | 0.272 |
| 1.4874 | 0.274 |
| 1.4887 | 0.275 |
| 1.49 | 0.274 |
| 1.4913 | 0.274 |
| 1.4926 | 0.274 |
| 1.4939 | 0.275 |
| 1.4952 | 0.276 |
| 1.4965 | 0.275 |
| 1.4978 | 0.276 |
| 1.4991 | 0.277 |
| 1.5004 | 0.276 |
| 1.5017 | 0.277 |
| 1.503 | 0.277 |
| 1.5043 | 0.278 |
| 1.5056 | 0.278 |
| 1.5069 | 0.277 |
| 1.5082 | 0.279 |
| 1.5095 | 0.281 |
| 1.5108 | 0.281 |
| 1.5121 | 0.281 |
| 1.5134 | 0.282 |
| 1.5147 | 0.284 |
| 1.516 | 0.285 |
| 1.5173 | 0.283 |
| 1.5186 | 0.283 |
| 1.5199 | 0.284 |
| 1.5212 | 0.286 |
| 1.5225 | 0.286 |
| 1.5238 | 0.285 |
| 1.5251 | 0.286 |
| 1.5264 | 0.285 |
| 1.5277 | 0.289 |
| 1.529 | 0.285 |
| 1.5303 | 0.286 |
| 1.5316 | 0.284 |
| 1.5329 | 0.284 |
| 1.5342 | 0.285 |
| 1.5355 | 0.283 |
| 1.5368 | 0.283 |
| 1.5381 | 0.281 |
| 1.5394 | 0.283 |
| 1.5407 | 0.281 |
| 1.542 | 0.281 |
| 1.5433 | 0.278 |
| 1.5446 | 0.278 |
| 1.5459 | 0.277 |
| 1.5472 | 0.276 |
| 1.5485 | 0.275 |
| 1.5498 | 0.272 |
| 1.5511 | 0.27 |
| 1.5524 | 0.271 |
| 1.5537 | 0.27 |
| 1.555 | 0.269 |
| 1.5563 | 0.269 |
| 1.5576 | 0.266 |
| 1.5589 | 0.268 |
| 1.5602 | 0.268 |
| 1.5615 | 0.265 |
| 1.5628 | 0.261 |
| 1.5641 | 0.262 |
| 1.5654 | 0.259 |
| 1.5667 | 0.258 |
| 1.568 | 0.258 |
| 1.5693 | 0.257 |
| 1.5706 | 0.256 |
| 1.5719 | 0.256 |
| 1.5732 | 0.254 |
| 1.5745 | 0.254 |
| 1.5758 | 0.252 |
| 1.5771 | 0.25 |
| 1.5784 | 0.25 |
| 1.5797 | 0.25 |
| 1.581 | 0.249 |
| 1.5823 | 0.25 |
| 1.5836 | 0.245 |
| 1.5849 | 0.245 |
| 1.5862 | 0.246 |
| 1.5875 | 0.246 |
| 1.5888 | 0.244 |
| 1.5901 | 0.243 |
| 1.5914 | 0.242 |
| 1.5927 | 0.243 |
| 1.594 | 0.242 |
| 1.5953 | 0.241 |
| 1.5966 | 0.239 |
| 1.5979 | 0.238 |
| 1.5992 | 0.237 |
| 1.6005 | 0.237 |
| 1.6018 | 0.235 |
| 1.6031 | 0.234 |
| 1.6044 | 0.235 |
| 1.6057 | 0.234 |
| 1.607 | 0.232 |
| 1.6083 | 0.23 |
| 1.6096 | 0.231 |
| 1.6109 | 0.23 |
| 1.6122 | 0.226 |
| 1.6135 | 0.226 |
| 1.6148 | 0.228 |
| 1.6161 | 0.226 |
| 1.6174 | 0.225 |
| 1.6187 | 0.224 |
| 1.62 | 0.223 |
| 1.6213 | 0.222 |
| 1.6226 | 0.223 |
| 1.6239 | 0.219 |
| 1.6252 | 0.219 |
| 1.6265 | 0.219 |
| 1.6278 | 0.221 |
| 1.6291 | 0.221 |
| 1.6304 | 0.218 |
| 1.6317 | 0.218 |
| 1.633 | 0.217 |
| 1.6343 | 0.216 |
| 1.6356 | 0.217 |
| 1.6369 | 0.216 |
| 1.6382 | 0.215 |
| 1.6395 | 0.216 |
| 1.6408 | 0.216 |
| 1.6421 | 0.216 |
| 1.6434 | 0.214 |
| 1.6447 | 0.212 |
| 1.646 | 0.214 |
| 1.6473 | 0.211 |
| 1.64914 | 0.215 |
| 1.65124 | 0.214 |
| 1.65335 | 0.217 |
| 1.65546 | 0.217 |
| 1.65758 | 0.208 |
| 1.6597 | 0.199 |
| 1.66183 | 0.198 |
| 1.66396 | 0.204 |
| 1.6661 | 0.205 |
| 1.66825 | 0.199 |
| 1.6704 | 0.194 |
| 1.67255 | 0.196 |
| 1.67471 | 0.199 |
| 1.67688 | 0.205 |
| 1.67905 | 0.201 |
| 1.68123 | 0.184 |
| 1.68341 | 0.178 |
| 1.6856 | 0.186 |
| 1.6878 | 0.196 |
| 1.69 | 0.197 |
| 1.6922 | 0.188 |
| 1.69441 | 0.181 |
| 1.69663 | 0.179 |
| 1.69886 | 0.178 |
| 1.70109 | 0.176 |
| 1.70332 | 0.174 |
| 1.70556 | 0.177 |
| 1.70781 | 0.175 |
| 1.71006 | 0.167 |
| 1.71232 | 0.164 |
| 1.71459 | 0.167 |
| 1.71686 | 0.172 |
| 1.71913 | 0.174 |
| 1.72142 | 0.17 |
| 1.72371 | 0.166 |
| 1.726 | 0.165 |
| 1.7283 | 0.162 |
| 1.73061 | 0.16 |
| 1.73292 | 0.162 |
| 1.73524 | 0.166 |
| 1.73757 | 0.166 |
| 1.7399 | 0.166 |
| 1.74224 | 0.163 |
| 1.74459 | 0.154 |
| 1.74694 | 0.151 |
| 1.74929 | 0.154 |
| 1.75166 | 0.158 |
| 1.75403 | 0.157 |
| 1.75641 | 0.151 |
| 1.75879 | 0.147 |
| 1.76118 | 0.15 |
| 1.76357 | 0.157 |
| 1.76598 | 0.156 |
| 1.76839 | 0.15 |
| 1.7708 | 0.146 |
| 1.77322 | 0.146 |
| 1.77565 | 0.147 |
| 1.77809 | 0.148 |
| 1.78053 | 0.146 |
| 1.78298 | 0.146 |
| 1.78544 | 0.145 |
| 1.7879 | 0.142 |
| 1.79037 | 0.138 |
| 1.79285 | 0.138 |
| 1.79533 | 0.139 |
| 1.79782 | 0.14 |
| 1.80032 | 0.142 |
| 1.80282 | 0.142 |
| 1.80533 | 0.137 |
| 1.80785 | 0.133 |
| 1.81037 | 0.134 |
| 1.81291 | 0.135 |
| 1.81544 | 0.132 |
| 1.81799 | 0.131 |
| 1.82054 | 0.129 |
| 1.8231 | 0.128 |
| 1.82567 | 0.13 |
| 1.82825 | 0.133 |
| 1.83083 | 0.131 |
| 1.83342 | 0.128 |
| 1.83602 | 0.126 |
| 1.83862 | 0.128 |
| 1.84123 | 0.129 |
| 1.84385 | 0.127 |
| 1.84648 | 0.127 |
| 1.84911 | 0.127 |
| 1.85175 | 0.127 |
| 1.8544 | 0.127 |
| 1.85706 | 0.125 |
| 1.85972 | 0.124 |
| 1.8624 | 0.123 |
| 1.86508 | 0.122 |
| 1.86776 | 0.123 |
| 1.87046 | 0.124 |
| 1.87316 | 0.124 |
| 1.87587 | 0.122 |
| 1.87859 | 0.122 |
| 1.88132 | 0.122 |
| 1.88405 | 0.12 |
| 1.88679 | 0.121 |
| 1.88954 | 0.126 |
| 1.8923 | 0.128 |
| 1.89507 | 0.124 |
| 1.89784 | 0.121 |
| 1.90063 | 0.122 |
| 1.90342 | 0.124 |
| 1.90622 | 0.126 |
| 1.90902 | 0.124 |
| 1.91184 | 0.124 |
| 1.91466 | 0.127 |
| 1.9175 | 0.129 |
| 1.92034 | 0.127 |
| 1.92319 | 0.123 |
| 1.92604 | 0.122 |
| 1.92891 | 0.123 |
| 1.93178 | 0.124 |
| 1.93467 | 0.124 |
| 1.93756 | 0.124 |
| 1.94046 | 0.122 |
| 1.94337 | 0.12 |
| 1.94629 | 0.119 |
| 1.94921 | 0.12 |
| 1.95215 | 0.119 |
| 1.95509 | 0.116 |
| 1.95805 | 0.114 |
| 1.96101 | 0.113 |
| 1.96398 | 0.112 |
| 1.96696 | 0.109 |
| 1.96995 | 0.107 |
| 1.97295 | 0.105 |
| 1.97596 | 0.104 |
| 1.97897 | 0.103 |
| 1.982 | 0.101 |
| 1.98503 | 0.099 |
| 1.98808 | 0.097 |
| 1.99113 | 0.096 |
| 1.9942 | 0.097 |
| 1.99727 | 0.096 |
| 2.00035 | 0.094 |
| 2.00344 | 0.093 |
| 2.00654 | 0.092 |
| 2.00965 | 0.09 |
| 2.01278 | 0.089 |
| 2.01591 | 0.088 |
| 2.01905 | 0.088 |
| 2.0222 | 0.087 |
| 2.02535 | 0.086 |
| 2.02852 | 0.085 |
| 2.0317 | 0.084 |
| 2.03489 | 0.082 |
| 2.03809 | 0.082 |
| 2.0413 | 0.082 |
| 2.04452 | 0.081 |
| 2.04775 | 0.08 |
| 2.05099 | 0.079 |
| 2.05424 | 0.078 |
| 2.0575 | 0.078 |
| 2.06077 | 0.077 |
| 2.06406 | 0.076 |
| 2.06735 | 0.075 |
| 2.07065 | 0.075 |
| 2.07396 | 0.074 |
| 2.07729 | 0.073 |
| 2.08062 | 0.072 |
| 2.08397 | 0.072 |
| 2.08732 | 0.071 |
| 2.09069 | 0.07 |
| 2.09407 | 0.069 |
| 2.09745 | 0.068 |
| 2.10085 | 0.067 |
| 2.10426 | 0.066 |
| 2.10769 | 0.066 |
| 2.11112 | 0.065 |
| 2.11456 | 0.065 |
| 2.11802 | 0.064 |
| 2.12148 | 0.064 |
| 2.12496 | 0.064 |
| 2.12845 | 0.063 |
| 2.13195 | 0.063 |
| 2.13546 | 0.063 |
| 2.13899 | 0.062 |
| 2.14252 | 0.062 |
| 2.14607 | 0.061 |
| 2.14963 | 0.061 |
| 2.1532 | 0.06 |
| 2.15678 | 0.06 |
| 2.16038 | 0.059 |
| 2.16399 | 0.059 |
| 2.1676 | 0.058 |
| 2.17123 | 0.057 |
| 2.17488 | 0.057 |
| 2.17853 | 0.056 |
| 2.1822 | 0.056 |
| 2.18588 | 0.055 |
| 2.18957 | 0.054 |
| 2.19328 | 0.054 |
| 2.197 | 0.054 |
| 2.20073 | 0.053 |
| 2.20447 | 0.053 |
| 2.20822 | 0.052 |
| 2.21199 | 0.051 |
| 2.21577 | 0.051 |
| 2.21957 | 0.051 |
| 2.22337 | 0.05 |
| 2.22719 | 0.049 |
| 2.23103 | 0.049 |
| 2.23487 | 0.049 |
| 2.23873 | 0.048 |
| 2.24261 | 0.047 |
| 2.24649 | 0.046 |
| 2.25039 | 0.045 |
| 2.25431 | 0.045 |
| 2.25824 | 0.045 |
| 2.26218 | 0.044 |
| 2.26613 | 0.044 |
| 2.2701 | 0.043 |
| 2.27408 | 0.043 |
| 2.27808 | 0.043 |
| 2.28209 | 0.043 |
| 2.28611 | 0.042 |
| 2.29015 | 0.042 |
| 2.29421 | 0.042 |
| 2.29828 | 0.042 |
| 2.30236 | 0.041 |
| 2.30645 | 0.041 |
| 2.31057 | 0.041 |
| 2.31469 | 0.04 |
| 2.31883 | 0.04 |
| 2.32299 | 0.04 |
| 2.32716 | 0.04 |
| 2.33134 | 0.039 |
| 2.33554 | 0.039 |
| 2.33976 | 0.039 |
| 2.34399 | 0.039 |
| 2.34824 | 0.038 |
| 2.3525 | 0.038 |
| 2.35678 | 0.038 |
| 2.36107 | 0.038 |
| 2.36538 | 0.037 |
| 2.3697 | 0.037 |
| 2.37404 | 0.037 |
| 2.3784 | 0.036 |
| 2.38277 | 0.036 |
| 2.38716 | 0.036 |
| 2.39156 | 0.036 |
| 2.39598 | 0.035 |
| 2.40042 | 0.035 |
| 2.40487 | 0.035 |
| 2.40934 | 0.034 |
| 2.41383 | 0.034 |
| 2.41833 | 0.035 |
| 2.42285 | 0.034 |
| 2.42739 | 0.034 |
| 2.43195 | 0.034 |
| 2.43652 | 0.034 |
| 2.44111 | 0.034 |
| 2.44571 | 0.034 |
| 2.45033 | 0.033 |
| 2.45498 | 0.033 |
| 2.45963 | 0.033 |
| 2.46431 | 0.033 |
| 2.469 | 0.033 |
| 2.47372 | 0.033 |
| 2.47845 | 0.033 |
| 2.48319 | 0.033 |
| 2.48796 | 0.032 |
| 2.49274 | 0.032 |
| 2.49755 | 0.032 |
| 2.50237 | 0.032 |
| 2.50721 | 0.032 |
| 2.51207 | 0.032 |
| 2.51695 | 0.032 |
| 2.52184 | 0.032 |
| 2.52676 | 0.032 |
| 2.53169 | 0.032 |
| 2.53665 | 0.031 |
| 2.54162 | 0.031 |
| 2.54662 | 0.031 |
| 2.55163 | 0.031 |
| 2.55666 | 0.031 |
| 2.56171 | 0.031 |
| 2.56679 | 0.031 |
| 2.57188 | 0.031 |
| 2.57699 | 0.031 |
| 2.58213 | 0.03 |
| 2.58728 | 0.03 |
| 2.59245 | 0.03 |
| 2.59765 | 0.031 |
| 2.60287 | 0.031 |
| 2.6081 | 0.031 |
| 2.61336 | 0.03 |
| 2.61864 | 0.03 |
| 2.62394 | 0.03 |
| 2.62926 | 0.03 |
| 2.63461 | 0.03 |
| 2.63997 | 0.031 |
| 2.64536 | 0.031 |
| 2.65077 | 0.031 |
| 2.6562 | 0.03 |
| 2.66166 | 0.03 |
| 2.66713 | 0.03 |
| 2.67263 | 0.03 |
| 2.67816 | 0.03 |
| 2.6837 | 0.03 |
| 2.68927 | 0.03 |
| 2.69486 | 0.03 |
| 2.70047 | 0.03 |
| 2.70611 | 0.031 |
| 2.71177 | 0.031 |
| 2.71746 | 0.031 |
| 2.72317 | 0.031 |
| 2.7289 | 0.031 |
| 2.73466 | 0.031 |
| 2.74044 | 0.031 |
| 2.74624 | 0.031 |
| 2.75207 | 0.032 |
| 2.75793 | 0.032 |
| 2.76381 | 0.034 |
| 2.76972 | 0.035 |
| 2.77565 | 0.037 |
| 2.7816 | 0.039 |
| 2.78759 | 0.042 |
| 2.79359 | 0.045 |
| 2.79963 | 0.048 |
| 2.80569 | 0.052 |
| 2.81177 | 0.055 |
| 2.81789 | 0.058 |
| 2.82402 | 0.061 |
| 2.83019 | 0.064 |
| 2.83638 | 0.066 |
| 2.8426 | 0.068 |
| 2.84885 | 0.071 |
| 2.85513 | 0.073 |
| 2.86143 | 0.074 |
| 2.86776 | 0.075 |
| 2.87412 | 0.076 |
| 2.8805 | 0.077 |
| 2.88692 | 0.077 |
| 2.89336 | 0.078 |
| 2.89984 | 0.079 |
| 2.90634 | 0.079 |
| 2.91287 | 0.079 |
| 2.91943 | 0.08 |
| 2.92602 | 0.08 |
| 2.93264 | 0.08 |
| 2.93929 | 0.08 |
| 2.94597 | 0.081 |
| 2.95268 | 0.08 |
| 2.95942 | 0.08 |
| 2.96619 | 0.08 |
| 2.973 | 0.08 |
| 2.97983 | 0.08 |
| 2.9867 | 0.079 |
| 2.9936 | 0.079 |
| 3.00053 | 0.079 |
| 3.00749 | 0.079 |
| 3.01448 | 0.078 |
| 3.02151 | 0.077 |
| 3.02857 | 0.076 |
| 3.03566 | 0.075 |
| 3.04279 | 0.075 |
| 3.04995 | 0.074 |
| 3.05714 | 0.073 |
| 3.06437 | 0.072 |
| 3.07163 | 0.071 |
| 3.07892 | 0.069 |
| 3.08626 | 0.067 |
| 3.09362 | 0.066 |
| 3.10102 | 0.065 |
| 3.10846 | 0.064 |
| 3.11593 | 0.063 |
| 3.12344 | 0.061 |
| 3.13098 | 0.06 |
| 3.13856 | 0.059 |
| 3.14618 | 0.058 |
| 3.15384 | 0.057 |
| 3.16153 | 0.056 |
| 3.16926 | 0.055 |
| 3.17703 | 0.054 |
| 3.18483 | 0.053 |
| 3.19268 | 0.052 |
| 3.20056 | 0.051 |
| 3.20848 | 0.05 |
| 3.21644 | 0.048 |
| 3.22445 | 0.047 |
| 3.23249 | 0.046 |
| 3.24057 | 0.045 |
| 3.24869 | 0.045 |
| 3.25685 | 0.044 |
| 3.26506 | 0.043 |
| 3.2733 | 0.042 |
| 3.28159 | 0.041 |
| 3.28992 | 0.041 |
| 3.29829 | 0.04 |
| 3.3067 | 0.039 |
| 3.31516 | 0.038 |
| 3.32366 | 0.037 |
| 3.3322 | 0.036 |
| 3.34079 | 0.035 |
| 3.34942 | 0.035 |
| 3.3581 | 0.034 |
| 3.36682 | 0.034 |
| 3.37559 | 0.033 |
| 3.38441 | 0.033 |
| 3.39326 | 0.032 |
| 3.40217 | 0.032 |
| 3.41112 | 0.031 |
| 3.42012 | 0.031 |
| 3.42917 | 0.031 |
| 3.43827 | 0.03 |
| 3.44741 | 0.03 |
| 3.45661 | 0.029 |
| 3.46585 | 0.029 |
| 3.47514 | 0.029 |
| 3.48448 | 0.029 |
| 3.49387 | 0.029 |
| 3.50332 | 0.029 |
| 3.51281 | 0.028 |
| 3.52236 | 0.028 |
| 3.53195 | 0.028 |
| 3.5416 | 0.028 |
| 3.55131 | 0.028 |
| 3.56106 | 0.028 |
| 3.57087 | 0.028 |
| 3.58074 | 0.028 |
| 3.59066 | 0.029 |
| 3.60063 | 0.029 |
| 3.61066 | 0.029 |
| 3.62075 | 0.029 |
| 3.63089 | 0.029 |
| 3.64109 | 0.029 |
| 3.65134 | 0.029 |
| 3.66166 | 0.029 |
| 3.67203 | 0.03 |
| 3.68246 | 0.03 |
| 3.69295 | 0.03 |
| 3.70351 | 0.03 |
| 3.71412 | 0.031 |
| 3.72479 | 0.031 |
| 3.73552 | 0.031 |
| 3.74632 | 0.031 |
| 3.75718 | 0.032 |
| 3.7681 | 0.032 |
| 3.77909 | 0.032 |
| 3.79014 | 0.032 |
| 3.80125 | 0.032 |
| 3.81243 | 0.033 |
| 3.82368 | 0.033 |
| 3.83499 | 0.034 |
| 3.84637 | 0.034 |
| 3.85782 | 0.034 |
| 3.86933 | 0.035 |
| 3.88092 | 0.035 |
| 3.89257 | 0.036 |
| 3.9043 | 0.036 |
| 3.91609 | 0.036 |
| 3.92796 | 0.037 |
| 3.9399 | 0.038 |
| 3.95191 | 0.038 |
| 3.964 | 0.039 |
| 3.97616 | 0.039 |
| 3.98839 | 0.04 |
| 4.0007 | 0.041 |
| 4.01309 | 0.041 |
| 4.02555 | 0.042 |
| 4.03809 | 0.043 |
| 4.05071 | 0.044 |
| 4.06341 | 0.045 |
| 4.07619 | 0.046 |
| 4.08904 | 0.047 |
| 4.10198 | 0.048 |
| 4.11501 | 0.049 |
| 4.12811 | 0.05 |
| 4.1413 | 0.051 |
| 4.15457 | 0.052 |
| 4.16793 | 0.054 |
| 4.18138 | 0.055 |
| 4.19491 | 0.056 |
| 4.20853 | 0.058 |
| 4.22224 | 0.06 |
| 4.23604 | 0.063 |
| 4.24993 | 0.066 |
| 4.26391 | 0.068 |
| 4.27798 | 0.071 |
| 4.29214 | 0.073 |
| 4.3064 | 0.074 |
| 4.32076 | 0.076 |
| 4.33521 | 0.078 |
| 4.34976 | 0.081 |
| 4.3644 | 0.084 |
| 4.37915 | 0.088 |
| 4.39399 | 0.092 |
| 4.40894 | 0.096 |
| 4.42398 | 0.1 |
| 4.43913 | 0.105 |
| 4.45439 | 0.111 |
| 4.46975 | 0.118 |
| 4.48522 | 0.125 |
| 4.50079 | 0.133 |
| 4.51647 | 0.14 |
| 4.53226 | 0.147 |
| 4.54817 | 0.152 |
| 4.56418 | 0.157 |
| 4.58031 | 0.162 |
| 4.59655 | 0.169 |
| 4.61291 | 0.177 |
| 4.62938 | 0.186 |
| 4.64598 | 0.195 |
| 4.66269 | 0.205 |
| 4.67952 | 0.216 |
| 4.69648 | 0.227 |
| 4.71355 | 0.239 |
| 4.73076 | 0.251 |
| 4.74808 | 0.265 |
| 4.76554 | 0.279 |
| 4.78313 | 0.294 |
| 4.80084 | 0.311 |
| 4.81869 | 0.329 |
| 4.83667 | 0.347 |
| 4.85478 | 0.366 |
| 4.87303 | 0.388 |
| 4.89142 | 0.41 |
| 4.90995 | 0.432 |
| 4.92862 | 0.456 |
| 4.94743 | 0.484 |
| 4.96639 | 0.51 |
| 4.98549 | 0.53 |
| 5.00474 | 0.558 |
| 5.02414 | 0.573 |
| 5.04369 | 0.595 |
| 5.06339 | 0.637 |
| 5.08324 | 0.68 |
| 5.10326 | 0.691 |
| 5.12343 | 0.803 |
| 5.14376 | 0.831 |
| 5.16425 | 0.903 |
| 5.18491 | 0.953 |
| 5.20573 | 1.007 |
| 5.22672 | 1.069 |
| 5.24788 | 1.13 |
| 5.26922 | 1.192 |
| 5.29072 | 1.269 |
| 5.31241 | 1.344 |
| 5.33427 | 1.416 |
| 5.35631 | 1.514 |
| 5.37854 | 1.604 |
| 5.40095 | 1.689 |
| 5.42354 | 1.808 |
| 5.44633 | 2.146 |
| 5.46931 | 2.39 |
| 5.49249 | 2.728 |
| 5.51586 | 2.92 |